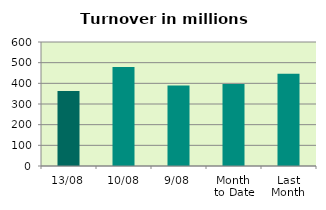
| Category | Series 0 |
|---|---|
| 13/08 | 362.722 |
| 10/08 | 478.495 |
| 9/08 | 389.086 |
| Month 
to Date | 396.81 |
| Last
Month | 446.279 |